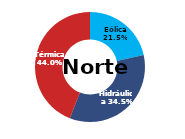
| Category | Norte |
|---|---|
| Eólica | 77.451 |
| Hidráulica | 124.281 |
| Solar | 0 |
| Térmica | 158.657 |